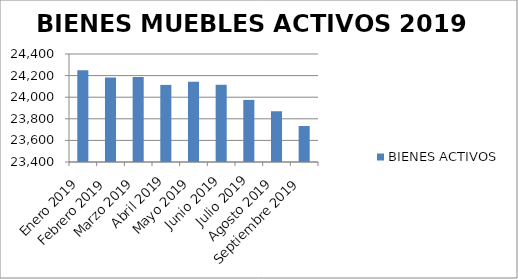
| Category | BIENES ACTIVOS |
|---|---|
| Enero 2019 | 24249 |
| Febrero 2019 | 24183 |
| Marzo 2019 | 24188 |
| Abril 2019 | 24114 |
| Mayo 2019 | 24143 |
| Junio 2019 | 24115 |
| Julio 2019 | 23975 |
| Agosto 2019 | 23870 |
| Septiembre 2019 | 23733 |